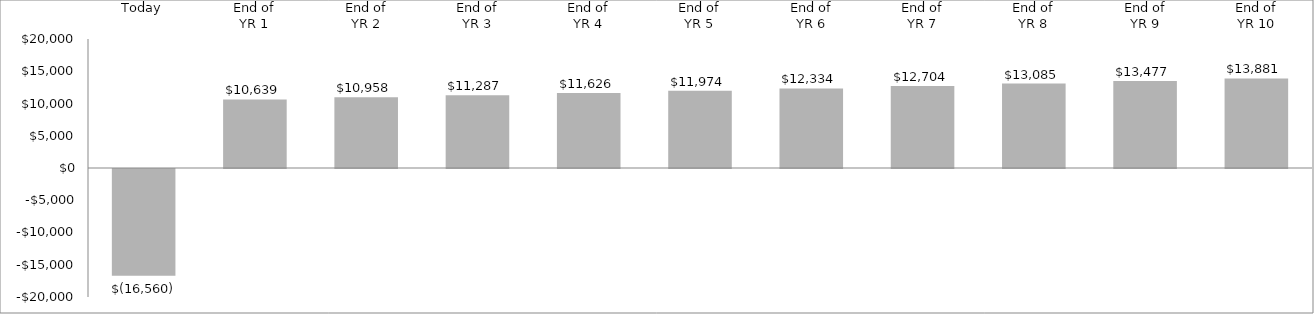
| Category | Annual Cash Flow |
|---|---|
| Today | -16560 |
| End of
YR 1 | 10639 |
| End of
YR 2 | 10958.17 |
| End of
YR 3 | 11286.915 |
| End of
YR 4 | 11625.523 |
| End of
YR 5 | 11974.288 |
| End of
YR 6 | 12333.517 |
| End of
YR 7 | 12703.522 |
| End of
YR 8 | 13084.628 |
| End of
YR 9 | 13477.167 |
| End of
YR 10 | 13881.482 |